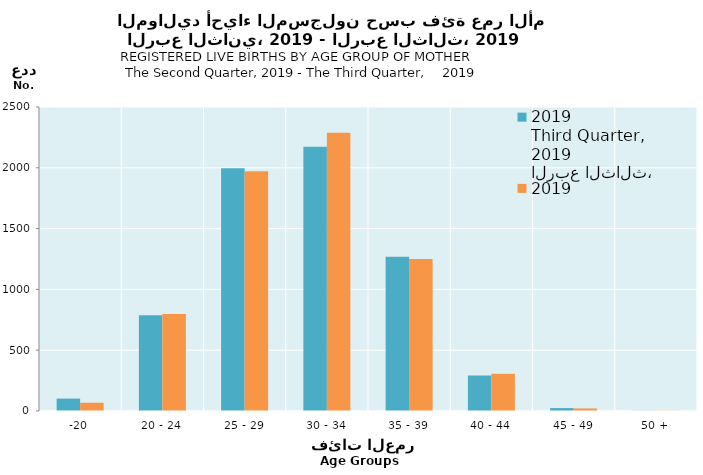
| Category | الربع الثالث، 2019
Third Quarter, 2019 | الربع الثاني، 2019
Second Quarter, 2019 |
|---|---|---|
| -20 | 102 | 68 |
| 20 - 24 | 787 | 797 |
| 25 - 29 | 1997 | 1972 |
| 30 - 34 | 2174 | 2288 |
| 35 - 39 | 1269 | 1249 |
| 40 - 44 | 292 | 306 |
| 45 - 49 | 24 | 21 |
| 50 + | 2 | 2 |